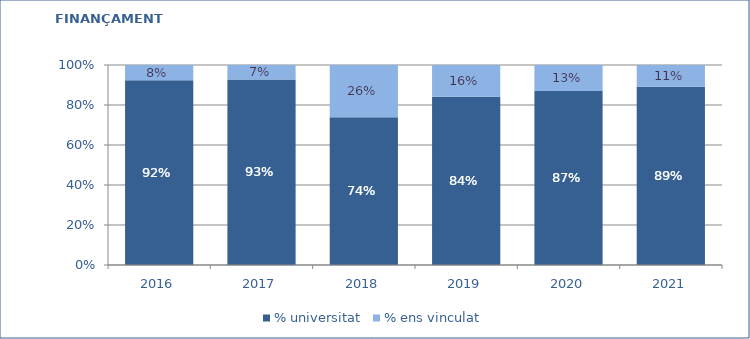
| Category | % universitat | % ens vinculat |
|---|---|---|
| 2016.0 | 0.923 | 0.077 |
| 2017.0 | 0.928 | 0.072 |
| 2018.0 | 0.739 | 0.261 |
| 2019.0 | 0.841 | 0.159 |
| 2020.0 | 0.869 | 0.131 |
| 2021.0 | 0.891 | 0.109 |